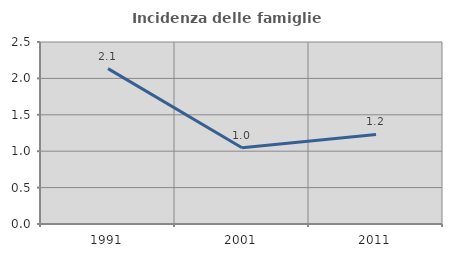
| Category | Incidenza delle famiglie numerose |
|---|---|
| 1991.0 | 2.135 |
| 2001.0 | 1.047 |
| 2011.0 | 1.23 |